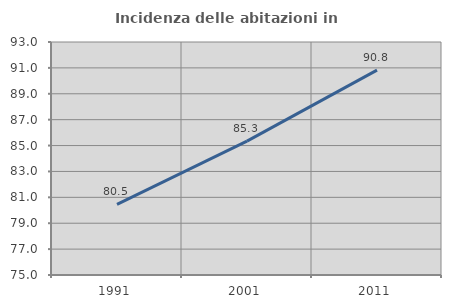
| Category | Incidenza delle abitazioni in proprietà  |
|---|---|
| 1991.0 | 80.457 |
| 2001.0 | 85.339 |
| 2011.0 | 90.83 |